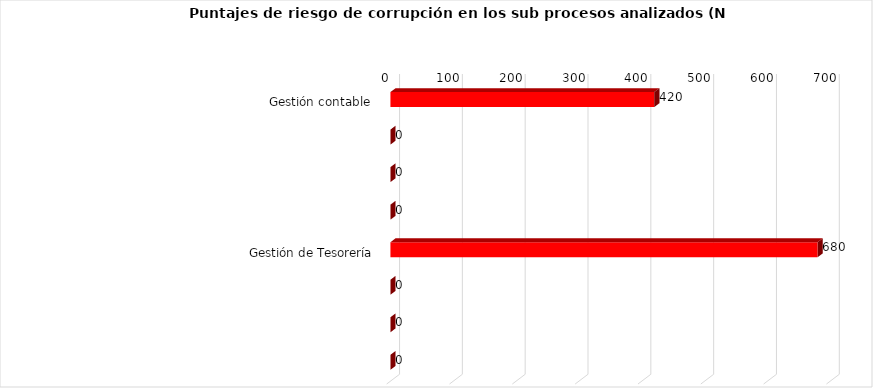
| Category | Series 0 |
|---|---|
| Gestión contable  | 420 |
|  | 0 |
|  | 0 |
|  | 0 |
| Gestión de Tesorería | 680 |